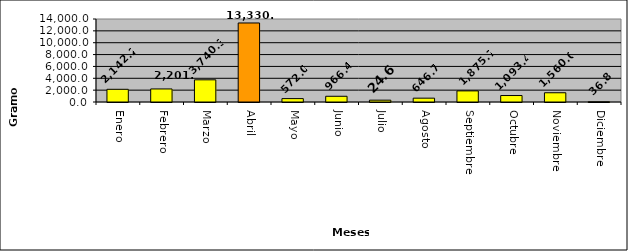
| Category | Heroína |
|---|---|
| Enero | 2142.2 |
| Febrero | 2201.5 |
| Marzo | 3740.3 |
| Abril | 13330.3 |
| Mayo | 572 |
| Junio | 966.4 |
| Julio | 310 |
| Agosto | 646.7 |
| Septiembre | 1875.7 |
| Octubre | 1093.4 |
| Noviembre | 1560 |
| Diciembre | 36.8 |